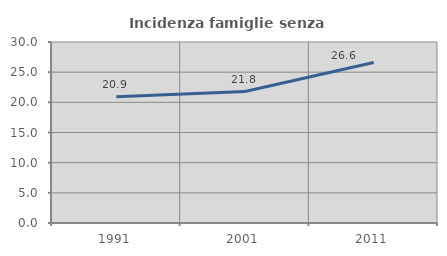
| Category | Incidenza famiglie senza nuclei |
|---|---|
| 1991.0 | 20.919 |
| 2001.0 | 21.782 |
| 2011.0 | 26.601 |